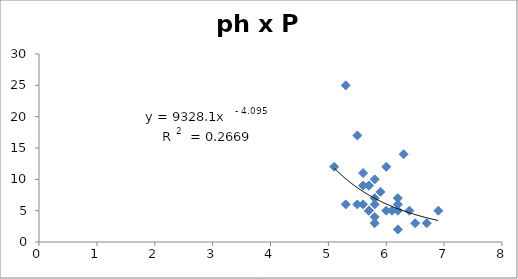
| Category | Series 0 |
|---|---|
| 6.3 | 14 |
| 6.2 | 7 |
| 6.2 | 6 |
| 6.5 | 3 |
| 6.7 | 3 |
| 6.9 | 5 |
| 6.4 | 5 |
| 5.3 | 25 |
| 5.5 | 17 |
| 5.7 | 9 |
| 5.8 | 4 |
| 6.2 | 2 |
| 6.1 | 5 |
| 6.0 | 12 |
| 5.7 | 5 |
| 5.8 | 3 |
| 5.3 | 6 |
| 5.1 | 12 |
| 5.6 | 11 |
| 5.7 | 9 |
| 5.7 | 5 |
| 5.8 | 6 |
| 5.6 | 6 |
| 6.2 | 5 |
| 5.6 | 9 |
| 5.5 | 6 |
| 5.8 | 7 |
| 5.8 | 10 |
| 5.9 | 8 |
| 6.0 | 5 |